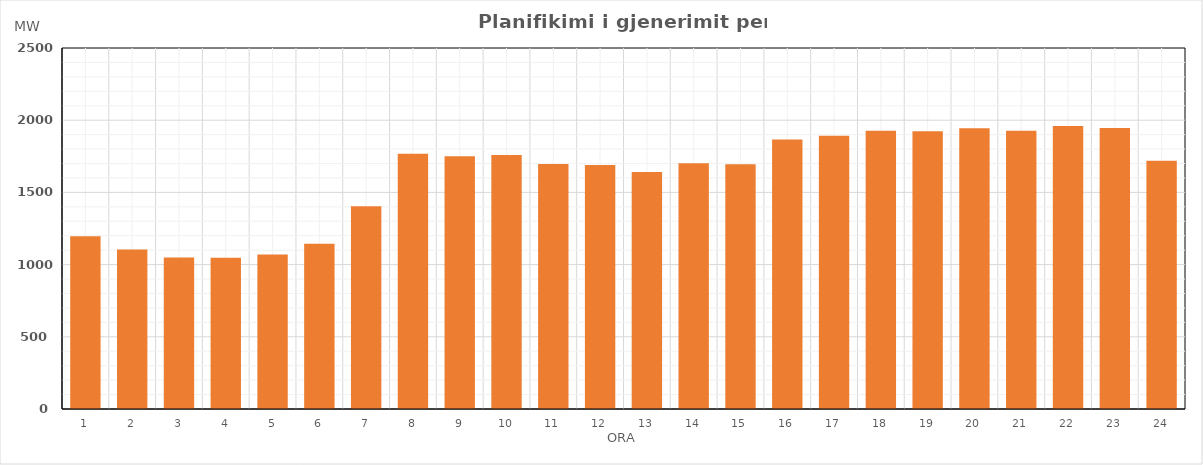
| Category | Max (MW) |
|---|---|
| 0 | 1195.599 |
| 1 | 1105.197 |
| 2 | 1048.699 |
| 3 | 1046.823 |
| 4 | 1070.286 |
| 5 | 1144.063 |
| 6 | 1404.687 |
| 7 | 1768.18 |
| 8 | 1750.024 |
| 9 | 1759.024 |
| 10 | 1696.121 |
| 11 | 1690.36 |
| 12 | 1641.567 |
| 13 | 1702.499 |
| 14 | 1694.63 |
| 15 | 1866.246 |
| 16 | 1893.066 |
| 17 | 1927.09 |
| 18 | 1922.615 |
| 19 | 1944.834 |
| 20 | 1926.69 |
| 21 | 1959.08 |
| 22 | 1946.451 |
| 23 | 1719.733 |